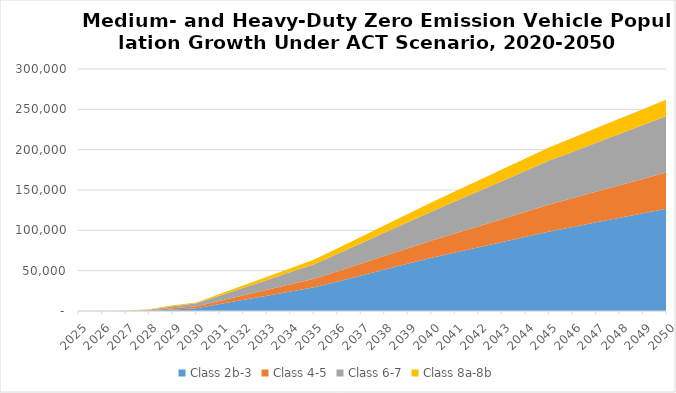
| Category | Class 2b-3 | Class 4-5 | Class 6-7 | Class 8a-8b |
|---|---|---|---|---|
| 2025.0 | 0 | 0 | 0 | 0 |
| 2026.0 | 0 | 0 | 0 | 0 |
| 2027.0 | 0 | 56.851 | 84.661 | 31.072 |
| 2028.0 | 394.238 | 531.231 | 856.038 | 311.752 |
| 2029.0 | 1753.771 | 1601.185 | 2625.829 | 1244.365 |
| 2030.0 | 3470 | 2280 | 3840 | 1060 |
| 2031.0 | 8642 | 3934 | 6676 | 2008 |
| 2032.0 | 13814 | 5588 | 9512 | 2956 |
| 2033.0 | 18986 | 7242 | 12348 | 3904 |
| 2034.0 | 24158 | 8896 | 15184 | 4852 |
| 2035.0 | 29330 | 10550 | 18020 | 5800 |
| 2036.0 | 36696 | 12676 | 21628 | 6936 |
| 2037.0 | 44062 | 14802 | 25236 | 8072 |
| 2038.0 | 51428 | 16928 | 28844 | 9208 |
| 2039.0 | 58794 | 19054 | 32452 | 10344 |
| 2040.0 | 66160 | 21180 | 36060 | 11480 |
| 2041.0 | 72622 | 23640 | 39742 | 12494 |
| 2042.0 | 79084 | 26100 | 43424 | 13508 |
| 2043.0 | 85546 | 28560 | 47106 | 14522 |
| 2044.0 | 92008 | 31020 | 50788 | 15536 |
| 2045.0 | 98470 | 33480 | 54470 | 16550 |
| 2046.0 | 104170 | 35808 | 57534 | 17328 |
| 2047.0 | 109870 | 38136 | 60598 | 18106 |
| 2048.0 | 115570 | 40464 | 63662 | 18884 |
| 2049.0 | 121270 | 42792 | 66726 | 19662 |
| 2050.0 | 126970 | 45120 | 69790 | 20440 |